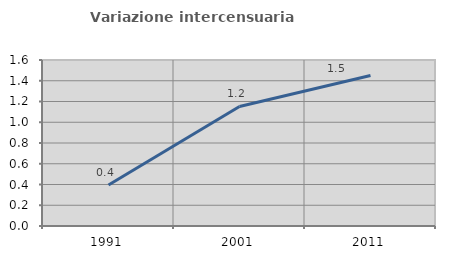
| Category | Variazione intercensuaria annua |
|---|---|
| 1991.0 | 0.396 |
| 2001.0 | 1.152 |
| 2011.0 | 1.451 |